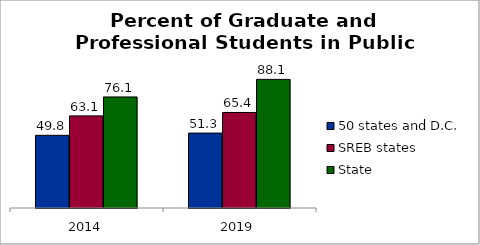
| Category | 50 states and D.C. | SREB states | State |
|---|---|---|---|
| 2014.0 | 49.777 | 63.095 | 76.063 |
| 2019.0 | 51.301 | 65.441 | 88.092 |